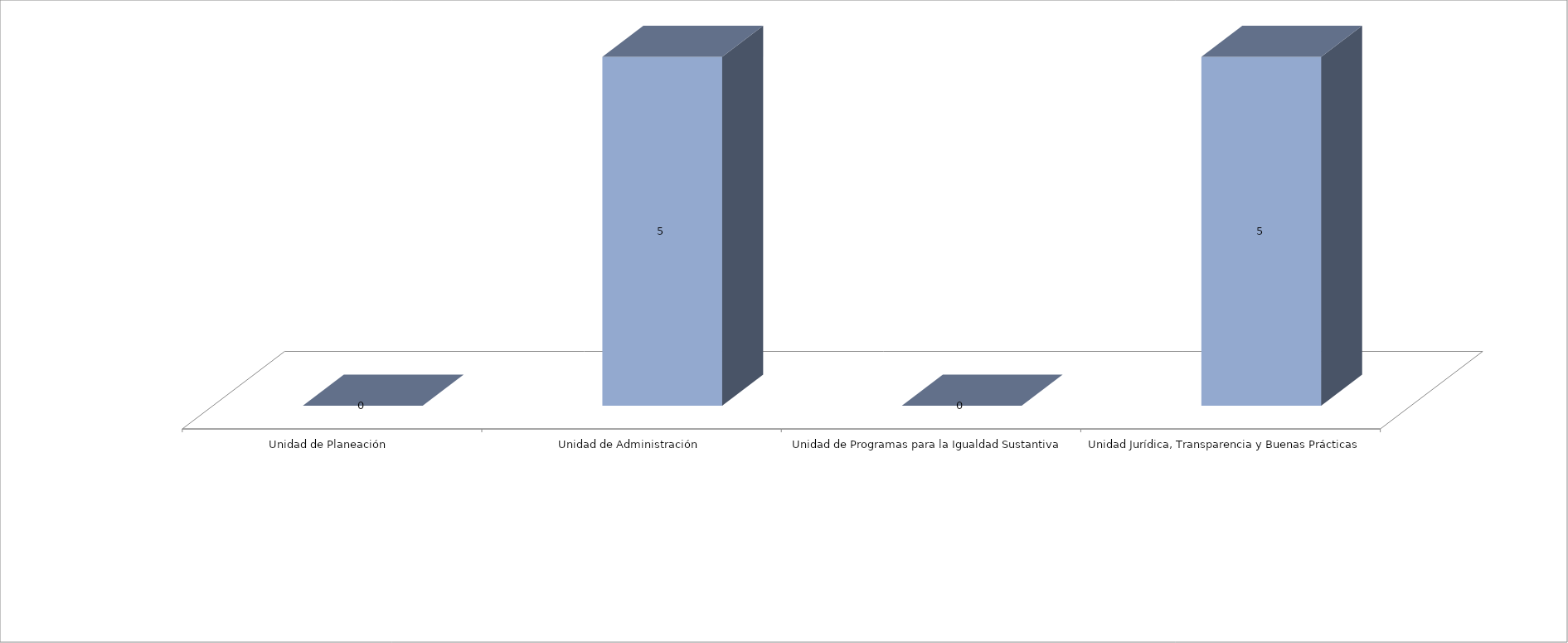
| Category | Series 0 | Series 1 |
|---|---|---|
| Unidad de Planeación  |  | 0 |
| Unidad de Administración |  | 5 |
| Unidad de Programas para la Igualdad Sustantiva |  | 0 |
| Unidad Jurídica, Transparencia y Buenas Prácticas  |  | 5 |